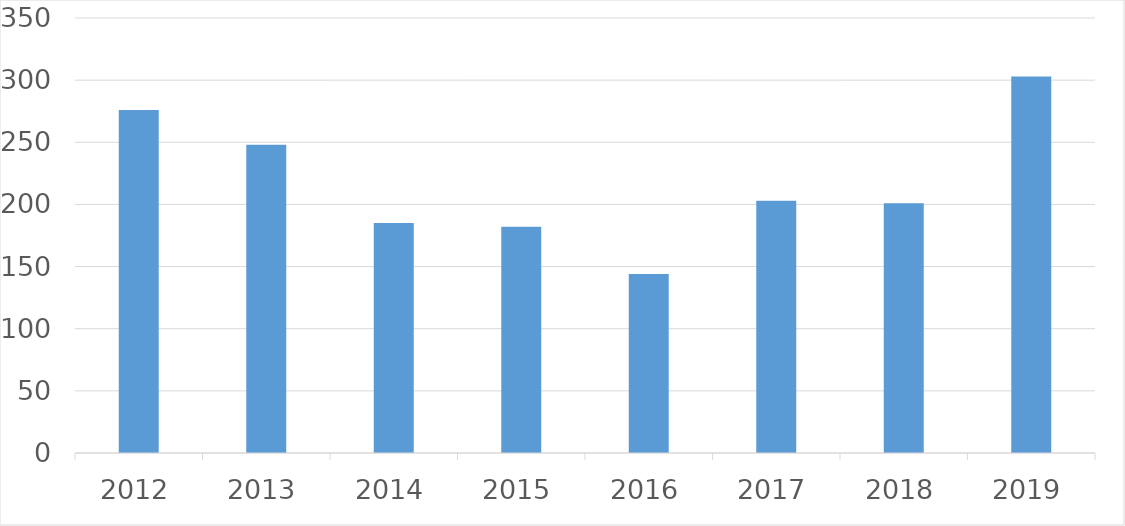
| Category | Series 0 |
|---|---|
| 2012 | 276 |
| 2013 | 248 |
| 2014 | 185 |
| 2015 | 182 |
| 2016 | 144 |
| 2017 | 203 |
| 2018 | 201 |
| 2019 | 303 |